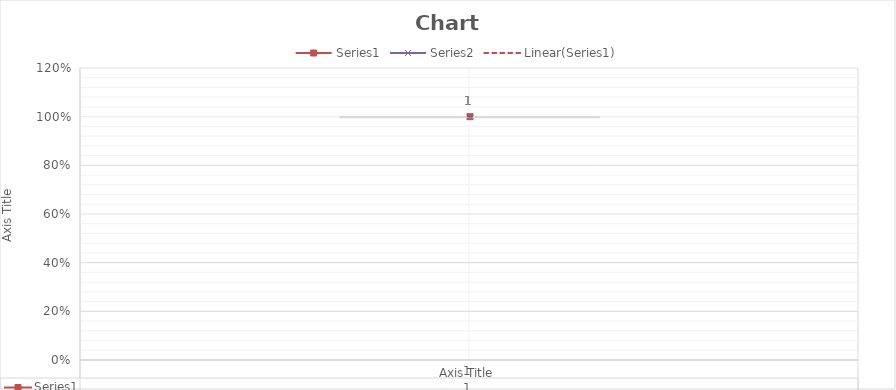
| Category | Series 1 | Series 3 |
|---|---|---|
| 0 | 1 | 1 |